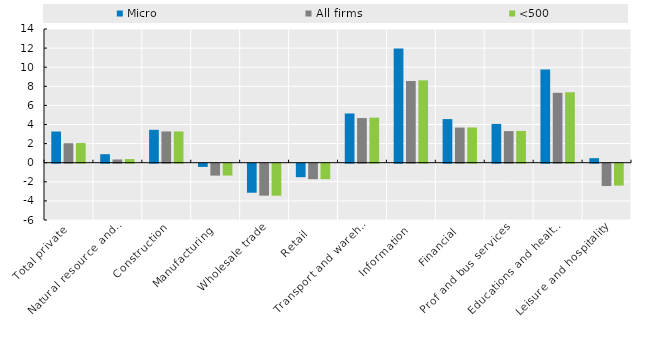
| Category | Micro | All firms | <500 |
|---|---|---|---|
| Total private | 3.266 | 2.037 | 2.056 |
| Natural resource and mining | 0.889 | 0.338 | 0.378 |
| Construction | 3.442 | 3.272 | 3.27 |
| Manufacturing | -0.339 | -1.248 | -1.243 |
| Wholesale trade | -3.038 | -3.345 | -3.35 |
| Retail  | -1.412 | -1.623 | -1.615 |
| Transport and warehousing | 5.156 | 4.677 | 4.72 |
| Information | 11.953 | 8.558 | 8.623 |
| Financial | 4.565 | 3.679 | 3.687 |
| Prof and bus services | 4.06 | 3.309 | 3.329 |
| Educations and health services | 9.752 | 7.319 | 7.373 |
| Leisure and hospitality | 0.475 | -2.333 | -2.293 |